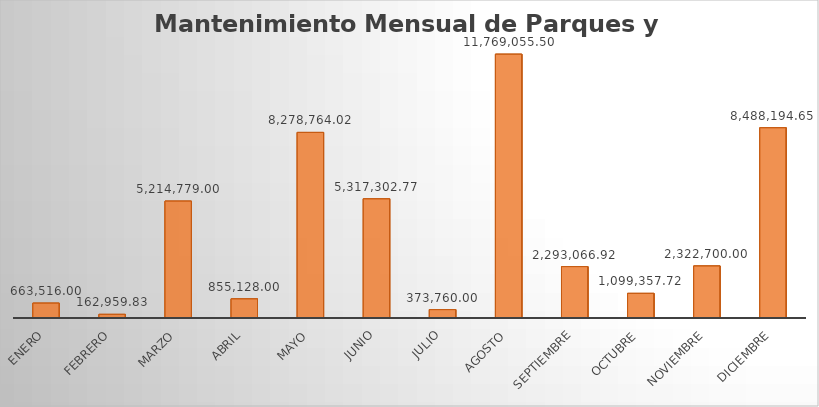
| Category | Monto |
|---|---|
| ENERO | 663516 |
| FEBRERO | 162959.83 |
| MARZO | 5214779 |
| ABRIL | 855128 |
| MAYO | 8278764.02 |
| JUNIO | 5317302.77 |
| JULIO | 373760 |
| AGOSTO | 11769055.5 |
| SEPTIEMBRE | 2293066.92 |
| OCTUBRE | 1099357.72 |
| NOVIEMBRE | 2322700 |
| DICIEMBRE | 8488194.65 |